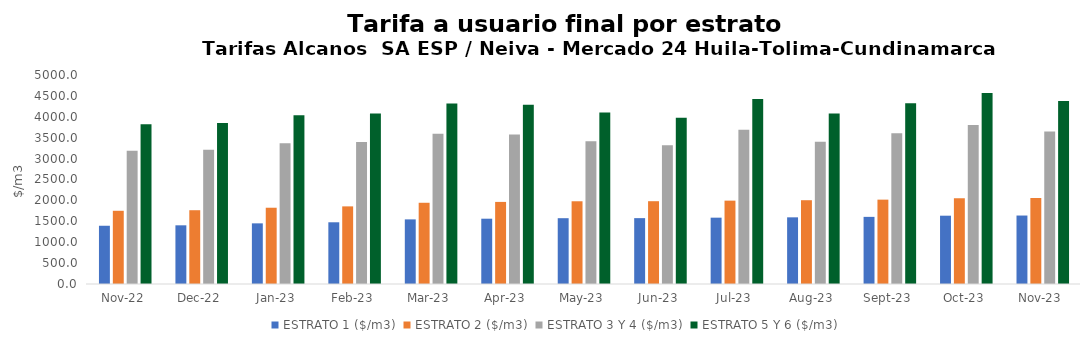
| Category | ESTRATO 1 ($/m3) | ESTRATO 2 ($/m3) | ESTRATO 3 Y 4 ($/m3) | ESTRATO 5 Y 6 ($/m3) |
|---|---|---|---|---|
| 2022-11-01 | 1393.41 | 1751.52 | 3185.9 | 3823.08 |
| 2022-12-01 | 1403.94 | 1765.16 | 3209.93 | 3851.916 |
| 2023-01-01 | 1450.9 | 1824.58 | 3365.49 | 4038.588 |
| 2023-02-01 | 1476.55 | 1857.05 | 3398.26 | 4077.912 |
| 2023-03-01 | 1545.84 | 1943.33 | 3596.1 | 4315.32 |
| 2023-04-01 | 1562.23 | 1963.79 | 3575.22 | 4290.264 |
| 2023-05-01 | 1574.25 | 1979.21 | 3416.65 | 4099.98 |
| 2023-06-01 | 1575.71 | 1980.83 | 3316.57 | 3979.884 |
| 2023-07-01 | 1586.9 | 1994.23 | 3689.81 | 4427.772 |
| 2023-08-01 | 1594.84 | 2004.4 | 3401.48 | 4081.776 |
| 2023-09-01 | 1606 | 2018.25 | 3603.59 | 4324.308 |
| 2023-10-01 | 1634.07 | 2053.24 | 3805.44 | 4566.528 |
| 2023-11-01 | 1638.05 | 2058.35 | 3648.51 | 4378.212 |